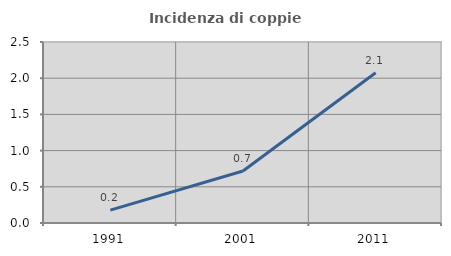
| Category | Incidenza di coppie miste |
|---|---|
| 1991.0 | 0.177 |
| 2001.0 | 0.718 |
| 2011.0 | 2.076 |